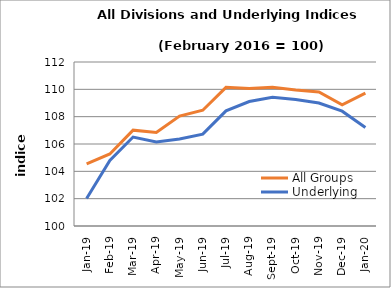
| Category | All Groups | Underlying |
|---|---|---|
| 2019-01-01 | 104.55 | 102.019 |
| 2019-02-01 | 105.272 | 104.794 |
| 2019-03-01 | 107.012 | 106.51 |
| 2019-04-01 | 106.842 | 106.143 |
| 2019-05-01 | 108.044 | 106.37 |
| 2019-06-01 | 108.473 | 106.721 |
| 2019-07-01 | 110.146 | 108.423 |
| 2019-08-01 | 110.057 | 109.11 |
| 2019-09-01 | 110.148 | 109.423 |
| 2019-10-01 | 109.943 | 109.256 |
| 2019-11-01 | 109.811 | 108.998 |
| 2019-12-01 | 108.864 | 108.4 |
| 2020-01-01 | 109.718 | 107.211 |